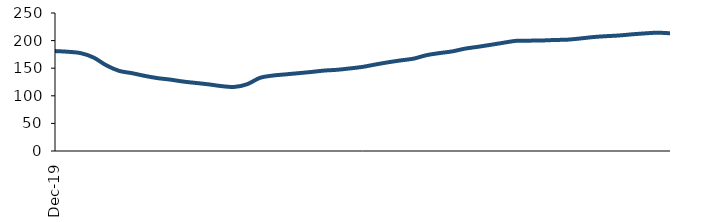
| Category | Series 0 |
|---|---|
| 2019-12-01 | 181.044 |
| 2020-01-01 | 179.776 |
| 2020-02-01 | 177.328 |
| 2020-03-01 | 169.453 |
| 2020-04-01 | 155.277 |
| 2020-05-01 | 145.207 |
| 2020-06-01 | 141.034 |
| 2020-07-01 | 136.109 |
| 2020-08-01 | 132.034 |
| 2020-09-01 | 129.3 |
| 2020-10-01 | 125.829 |
| 2020-11-01 | 123.263 |
| 2020-12-01 | 120.707 |
| 2021-01-01 | 117.538 |
| 2021-02-01 | 116.084 |
| 2021-03-01 | 121.021 |
| 2021-04-01 | 132.55 |
| 2021-05-01 | 136.669 |
| 2021-06-01 | 138.833 |
| 2021-07-01 | 140.97 |
| 2021-08-01 | 143.159 |
| 2021-09-01 | 145.68 |
| 2021-10-01 | 147.105 |
| 2021-11-01 | 149.536 |
| 2021-12-01 | 152.367 |
| 2022-01-01 | 156.659 |
| 2022-02-01 | 160.695 |
| 2022-03-01 | 164.187 |
| 2022-04-01 | 167.372 |
| 2022-05-01 | 173.631 |
| 2022-06-01 | 177.334 |
| 2022-07-01 | 180.425 |
| 2022-08-01 | 185.427 |
| 2022-09-01 | 188.732 |
| 2022-10-01 | 192.332 |
| 2022-11-01 | 196.105 |
| 2022-12-01 | 199.604 |
| 2023-01-01 | 199.904 |
| 2023-02-01 | 200.222 |
| 2023-03-01 | 201.111 |
| 2023-04-01 | 201.711 |
| 2023-05-01 | 203.854 |
| 2023-06-01 | 206.402 |
| 2023-07-01 | 207.99 |
| 2023-08-01 | 209.236 |
| 2023-09-01 | 211.29 |
| 2023-10-01 | 213.009 |
| 2023-11-01 | 214.281 |
| 2023-12-01 | 213.269 |